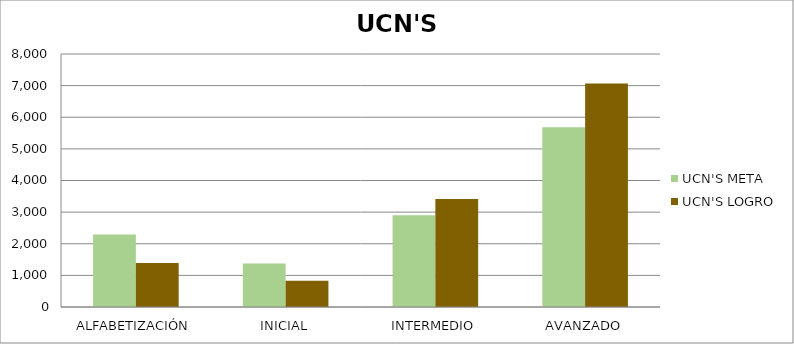
| Category | UCN'S |
|---|---|
| ALFABETIZACIÓN | 1393 |
| INICIAL | 829 |
| INTERMEDIO | 3417 |
| AVANZADO | 7070 |